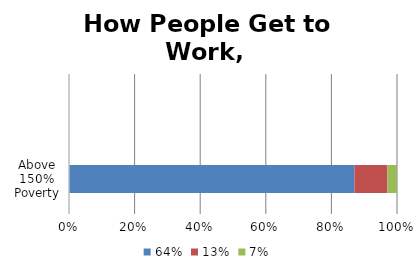
| Category | 64% | 13% | 7% |
|---|---|---|---|
| Above 150% Poverty | 0.79 | 0.091 | 0.027 |